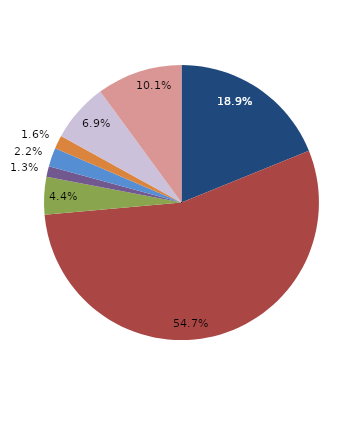
| Category | Series 0 |
|---|---|
| قبل الدخول | 18.868 |
| -1 | 54.717 |
| 1 | 4.403 |
| 2 | 1.258 |
| 3 | 2.201 |
| 4 | 1.572 |
|  5 - 9 | 6.918 |
| 10 - 14 | 10.063 |